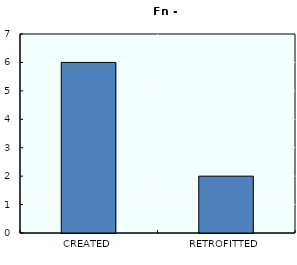
| Category | Series 0 |
|---|---|
| CREATED | 6 |
| RETROFITTED | 2 |